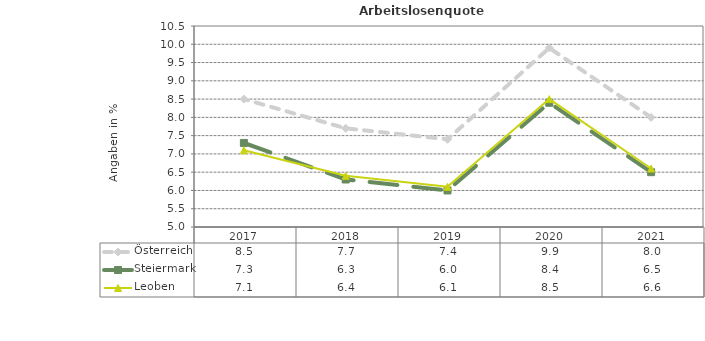
| Category | Österreich | Steiermark | Leoben |
|---|---|---|---|
| 2021.0 | 8 | 6.5 | 6.6 |
| 2020.0 | 9.9 | 8.4 | 8.5 |
| 2019.0 | 7.4 | 6 | 6.1 |
| 2018.0 | 7.7 | 6.3 | 6.4 |
| 2017.0 | 8.5 | 7.3 | 7.1 |